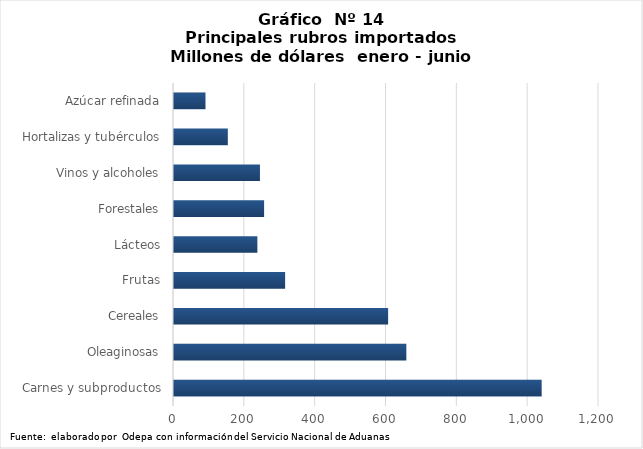
| Category | Series 0 |
|---|---|
| Carnes y subproductos | 1038133.29 |
| Oleaginosas | 656026.57 |
| Cereales | 604565.238 |
| Frutas | 313773.962 |
| Lácteos | 235404.928 |
| Forestales | 254406 |
| Vinos y alcoholes | 242693.526 |
| Hortalizas y tubérculos | 151994.281 |
| Azúcar refinada | 88903.633 |